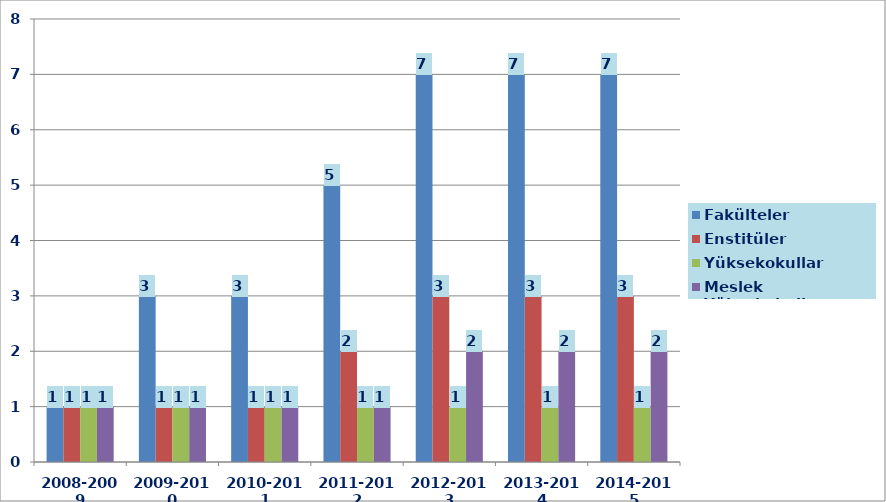
| Category | Fakülteler | Enstitüler | Yüksekokullar | Meslek Yüksekokulları |
|---|---|---|---|---|
| 2008-2009 | 1 | 1 | 1 | 1 |
| 2009-2010 | 3 | 1 | 1 | 1 |
| 2010-2011 | 3 | 1 | 1 | 1 |
| 2011-2012 | 5 | 2 | 1 | 1 |
| 2012-2013 | 7 | 3 | 1 | 2 |
| 2013-2014 | 7 | 3 | 1 | 2 |
| 2014-2015 | 7 | 3 | 1 | 2 |